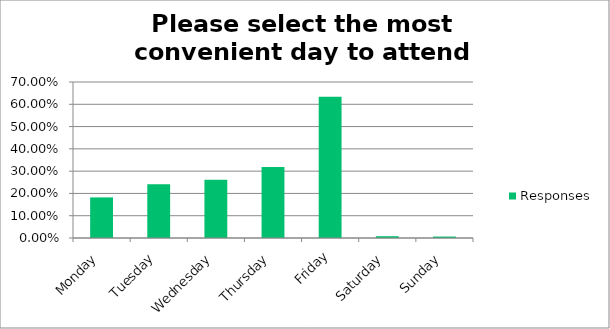
| Category | Responses |
|---|---|
| Monday | 0.182 |
| Tuesday | 0.241 |
| Wednesday | 0.262 |
| Thursday | 0.319 |
| Friday | 0.634 |
| Saturday | 0.008 |
| Sunday | 0.007 |